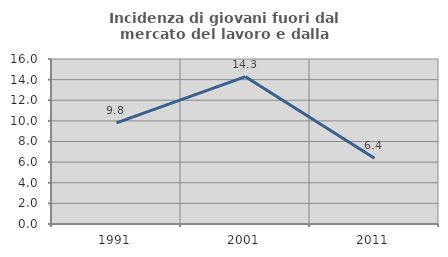
| Category | Incidenza di giovani fuori dal mercato del lavoro e dalla formazione  |
|---|---|
| 1991.0 | 9.804 |
| 2001.0 | 14.286 |
| 2011.0 | 6.383 |